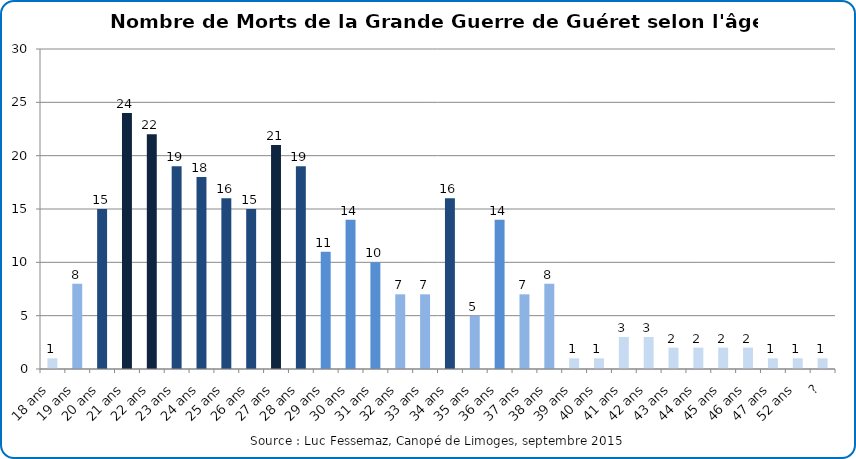
| Category | Nombre de Morts de la Grande Guerre de Guéret selon l'âge au décès |
|---|---|
| 18 ans | 1 |
| 19 ans | 8 |
| 20 ans | 15 |
| 21 ans | 24 |
| 22 ans | 22 |
| 23 ans | 19 |
| 24 ans | 18 |
| 25 ans | 16 |
| 26 ans | 15 |
| 27 ans | 21 |
| 28 ans | 19 |
| 29 ans | 11 |
| 30 ans | 14 |
| 31 ans | 10 |
| 32 ans | 7 |
| 33 ans | 7 |
| 34 ans | 16 |
| 35 ans | 5 |
| 36 ans | 14 |
| 37 ans | 7 |
| 38 ans | 8 |
| 39 ans | 1 |
| 40 ans | 1 |
| 41 ans | 3 |
| 42 ans | 3 |
| 43 ans | 2 |
| 44 ans | 2 |
| 45 ans | 2 |
| 46 ans | 2 |
| 47 ans | 1 |
| 52 ans | 1 |
| ? | 1 |